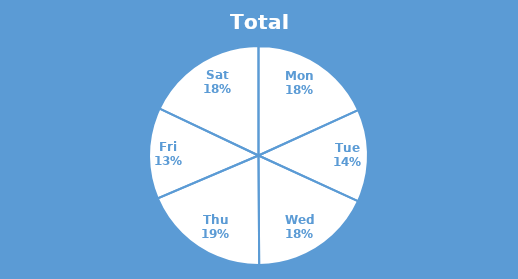
| Category | Totals |
|---|---|
| Mon | 3650 |
| Tue | 2740 |
| Wed | 3620 |
| Thu | 3750 |
| Fri | 2700 |
| Sat | 3600 |